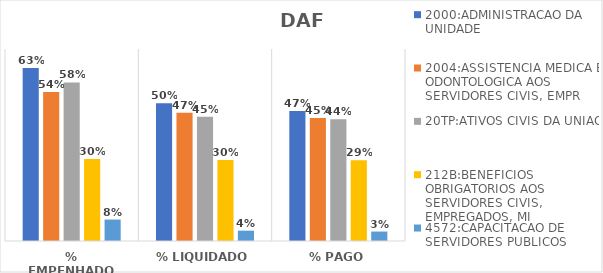
| Category | 2000:ADMINISTRACAO DA UNIDADE | 2004:ASSISTENCIA MEDICA E ODONTOLOGICA AOS SERVIDORES CIVIS, EMPR | 20TP:ATIVOS CIVIS DA UNIAO | 212B:BENEFICIOS OBRIGATORIOS AOS SERVIDORES CIVIS, EMPREGADOS, MI | 4572:CAPACITACAO DE SERVIDORES PUBLICOS FEDERAIS EM PROCESSO DE Q |
|---|---|---|---|---|---|
| % EMPENHADO | 0.631 | 0.544 | 0.578 | 0.299 | 0.078 |
| % LIQUIDADO | 0.502 | 0.468 | 0.453 | 0.295 | 0.038 |
| % PAGO | 0.474 | 0.449 | 0.443 | 0.295 | 0.034 |